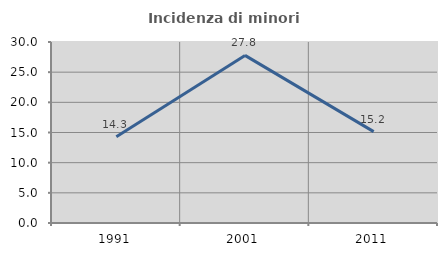
| Category | Incidenza di minori stranieri |
|---|---|
| 1991.0 | 14.286 |
| 2001.0 | 27.778 |
| 2011.0 | 15.152 |